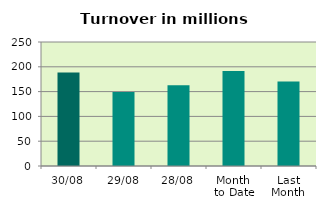
| Category | Series 0 |
|---|---|
| 30/08 | 188.602 |
| 29/08 | 149.215 |
| 28/08 | 162.681 |
| Month 
to Date | 191.512 |
| Last
Month | 170.387 |